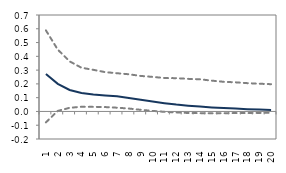
| Category | lower bound | median | upper bound |
|---|---|---|---|
| 1.0 | -0.079 | 0.272 | 0.588 |
| 2.0 | 0.004 | 0.2 | 0.449 |
| 3.0 | 0.026 | 0.156 | 0.363 |
| 4.0 | 0.034 | 0.134 | 0.317 |
| 5.0 | 0.033 | 0.123 | 0.302 |
| 6.0 | 0.032 | 0.116 | 0.285 |
| 7.0 | 0.027 | 0.11 | 0.277 |
| 8.0 | 0.021 | 0.097 | 0.27 |
| 9.0 | 0.012 | 0.084 | 0.258 |
| 10.0 | 0.004 | 0.072 | 0.251 |
| 11.0 | -0.003 | 0.06 | 0.242 |
| 12.0 | -0.007 | 0.05 | 0.242 |
| 13.0 | -0.011 | 0.042 | 0.236 |
| 14.0 | -0.013 | 0.035 | 0.233 |
| 15.0 | -0.013 | 0.029 | 0.224 |
| 16.0 | -0.013 | 0.024 | 0.215 |
| 17.0 | -0.012 | 0.021 | 0.211 |
| 18.0 | -0.011 | 0.017 | 0.205 |
| 19.0 | -0.011 | 0.014 | 0.201 |
| 20.0 | -0.009 | 0.011 | 0.198 |